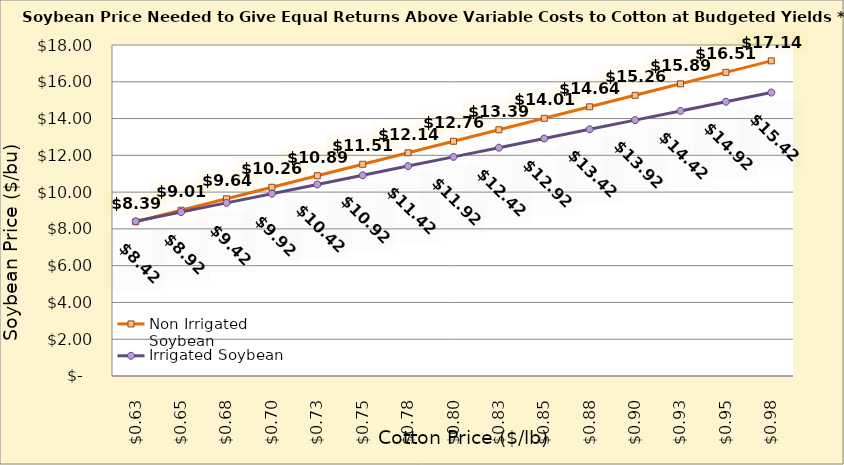
| Category | Non Irrigated Soybean | Irrigated Soybean |
|---|---|---|
| 0.6249999999999999 | 8.389 | 8.415 |
| 0.6499999999999999 | 9.014 | 8.915 |
| 0.6749999999999999 | 9.639 | 9.415 |
| 0.7 | 10.264 | 9.915 |
| 0.725 | 10.889 | 10.415 |
| 0.75 | 11.514 | 10.915 |
| 0.775 | 12.139 | 11.415 |
| 0.8 | 12.764 | 11.915 |
| 0.8250000000000001 | 13.389 | 12.415 |
| 0.8500000000000001 | 14.014 | 12.915 |
| 0.8750000000000001 | 14.639 | 13.415 |
| 0.9000000000000001 | 15.264 | 13.915 |
| 0.9250000000000002 | 15.889 | 14.415 |
| 0.9500000000000002 | 16.514 | 14.915 |
| 0.9750000000000002 | 17.139 | 15.415 |